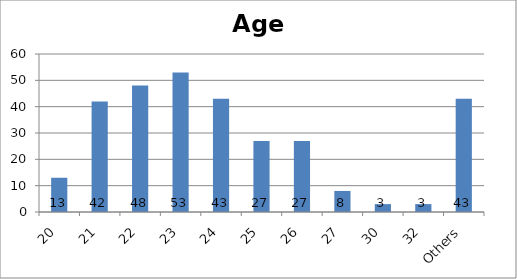
| Category | Age |
|---|---|
| 20 | 13 |
| 21 | 42 |
| 22 | 48 |
| 23 | 53 |
| 24 | 43 |
| 25 | 27 |
| 26 | 27 |
| 27 | 8 |
| 30 | 3 |
| 32 | 3 |
| Others | 43 |